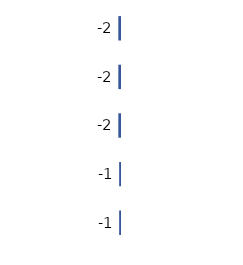
| Category | Series 0 |
|---|---|
| 0 | -2 |
| 1 | -2 |
| 2 | -2 |
| 3 | -1 |
| 4 | -1 |